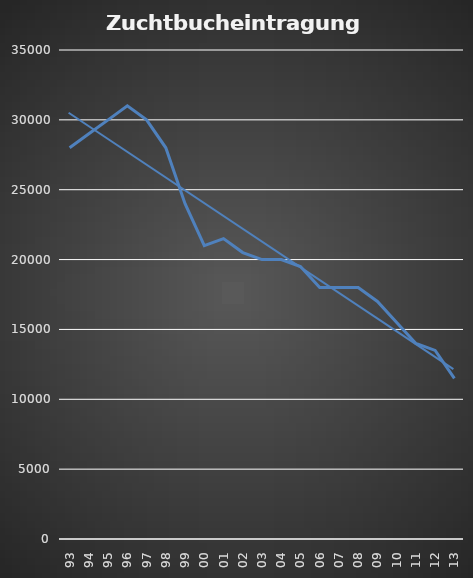
| Category | Series 0 |
|---|---|
| 93 | 28000 |
| 94 | 29000 |
| 95 | 30000 |
| 96 | 31000 |
| 97 | 30000 |
| 98 | 28000 |
| 99 | 24000 |
| 00 | 21000 |
| 01 | 21500 |
| 02 | 20500 |
| 03 | 20000 |
| 04 | 20000 |
| 05 | 19500 |
| 06 | 17995 |
| 07 | 18000 |
| 08 | 18000 |
| 09 | 17000 |
| 10 | 15500 |
| 11 | 14000 |
| 12 | 13500 |
| 13 | 11500 |